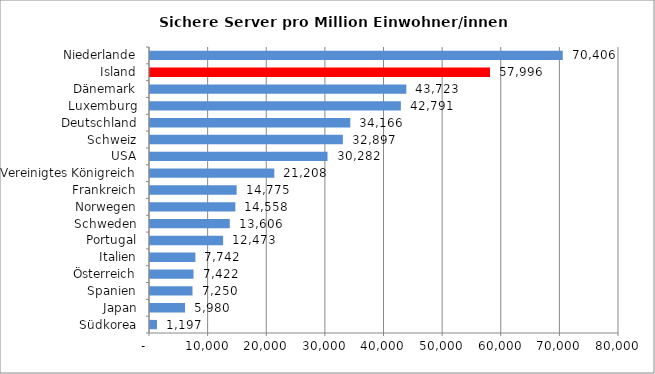
| Category | 2015 |
|---|---|
| Südkorea | 1196.513 |
| Japan | 5980.236 |
| Spanien | 7250.339 |
| Österreich | 7421.89 |
| Italien | 7742.181 |
| Portugal | 12472.753 |
| Schweden | 13605.531 |
| Norwegen | 14558.075 |
| Frankreich | 14775.178 |
| Vereinigtes Königreich | 21207.631 |
| USA | 30282.423 |
| Schweiz | 32896.816 |
| Deutschland | 34165.572 |
| Luxemburg | 42790.963 |
| Dänemark | 43722.766 |
| Island | 57995.687 |
| Niederlande | 70405.725 |